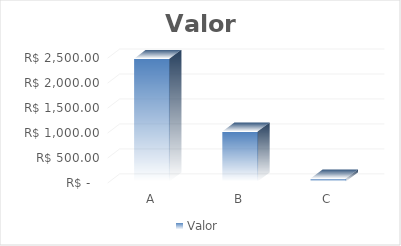
| Category | Valor |
|---|---|
| A | 2460 |
| B | 1000 |
| C | 59.2 |